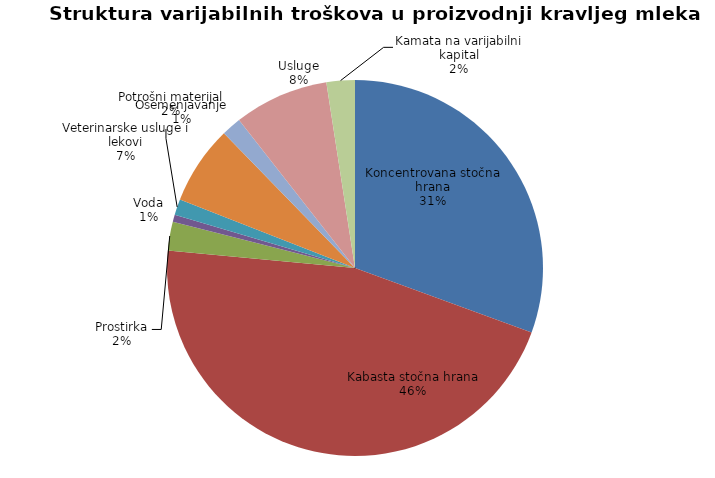
| Category | Series 0 |
|---|---|
| Koncentrovana stočna hrana | 45060 |
| Kabasta stočna hrana | 67650 |
| Prostirka | 3650 |
| Voda | 912.5 |
| Osemenjavanje | 2000 |
| Veterinarske usluge i lekovi | 10000 |
| Potrošni materijal | 2500 |
| Usluge | 12000 |
| Kamata na varijabilni kapital | 3594.312 |